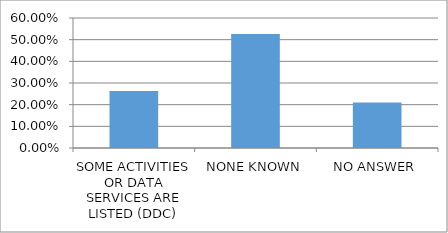
| Category | Series 0 |
|---|---|
| SOME ACTIVITIES OR DATA SERVICES ARE LISTED (DDC) | 0.263 |
| NONE KNOWN | 0.526 |
| NO ANSWER | 0.211 |